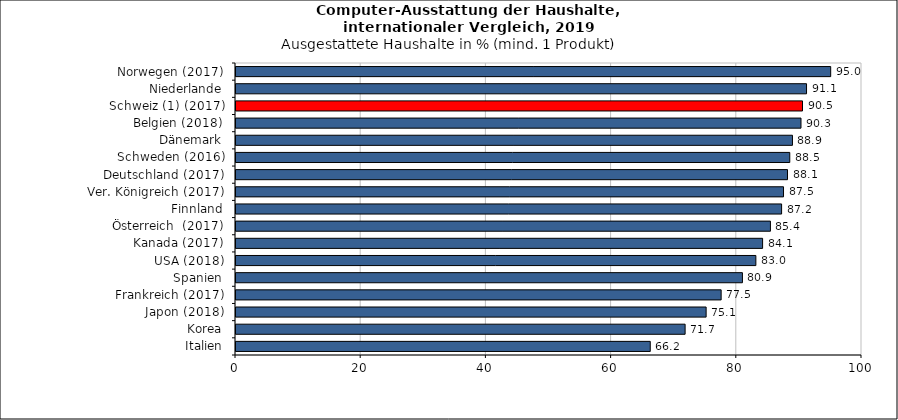
| Category | Italien |
|---|---|
| Italien | 66.176 |
| Korea | 71.744 |
| Japon (2018) | 75.1 |
| Frankreich (2017) | 77.5 |
| Spanien | 80.9 |
| USA (2018) | 83.045 |
| Kanada (2017) | 84.123 |
| Österreich  (2017) | 85.373 |
| Finnland | 87.157 |
| Ver. Königreich (2017) | 87.464 |
| Deutschland (2017) | 88.1 |
| Schweden (2016) | 88.463 |
| Dänemark | 88.891 |
| Belgien (2018) | 90.254 |
| Schweiz (1) (2017) | 90.496 |
| Niederlande | 91.139 |
| Norwegen (2017) | 95 |